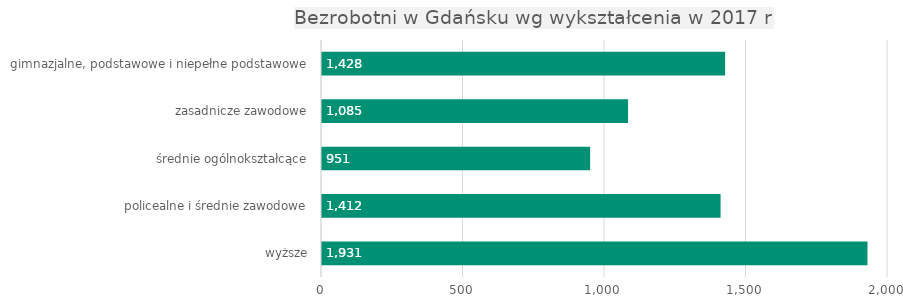
| Category | Series 0 |
|---|---|
| wyższe | 1931 |
| policealne i średnie zawodowe | 1412 |
| średnie ogólnokształcące | 951 |
| zasadnicze zawodowe | 1085 |
| gimnazjalne, podstawowe i niepełne podstawowe | 1428 |